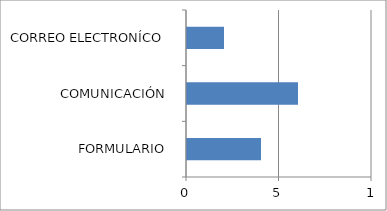
| Category | Series 0 |
|---|---|
| FORMULARIO  | 4 |
| COMUNICACIÓN  | 6 |
| CORREO ELECTRONÍCO  | 2 |